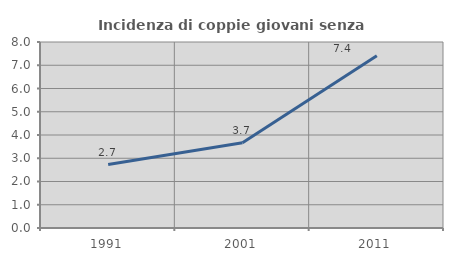
| Category | Incidenza di coppie giovani senza figli |
|---|---|
| 1991.0 | 2.727 |
| 2001.0 | 3.67 |
| 2011.0 | 7.407 |